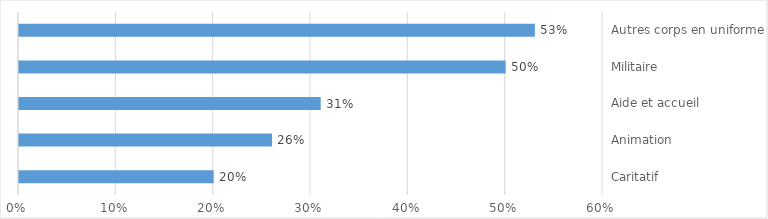
| Category | Series 0 |
|---|---|
| Caritatif | 0.2 |
| Animation | 0.26 |
| Aide et accueil | 0.31 |
| Militaire | 0.5 |
| Autres corps en uniforme | 0.53 |